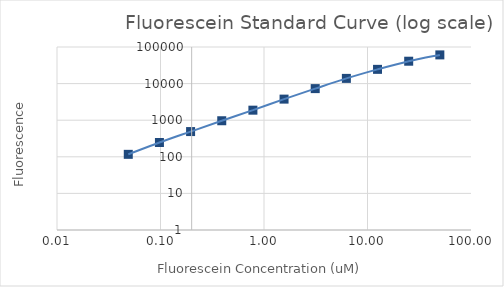
| Category | Series 1 |
|---|---|
| 50.0 | 60853.75 |
| 25.0 | 40900.5 |
| 12.5 | 24505.75 |
| 6.25 | 13879 |
| 3.125 | 7294.25 |
| 1.5625 | 3767.5 |
| 0.78125 | 1879 |
| 0.390625 | 966 |
| 0.1953125 | 489 |
| 0.09765625 | 245.5 |
| 0.048828125 | 116.75 |